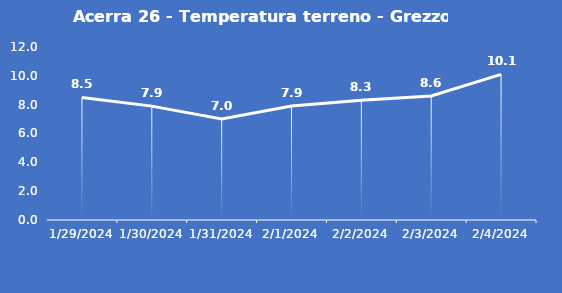
| Category | Acerra 26 - Temperatura terreno - Grezzo (°C) |
|---|---|
| 1/29/24 | 8.5 |
| 1/30/24 | 7.9 |
| 1/31/24 | 7 |
| 2/1/24 | 7.9 |
| 2/2/24 | 8.3 |
| 2/3/24 | 8.6 |
| 2/4/24 | 10.1 |